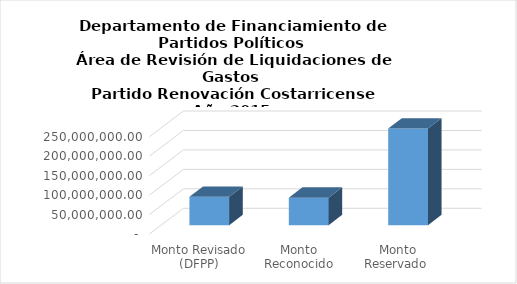
| Category | Series 0 |
|---|---|
| Monto Revisado (DFPP) | 72714709.22 |
| Monto Reconocido (TSE) | 70625910.85 |
| Monto Reservado  | 248234549.436 |